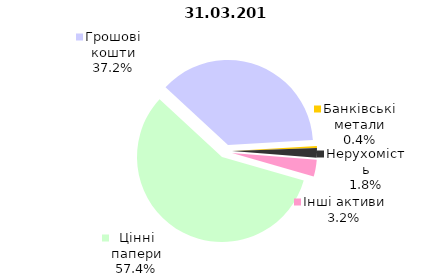
| Category | 31.03.2018 |
|---|---|
| Цінні папери | 1427 |
| Грошові кошти | 923.9 |
| Банківські метали | 9.7 |
| Нерухомість | 45.1 |
| Інші активи | 79.5 |